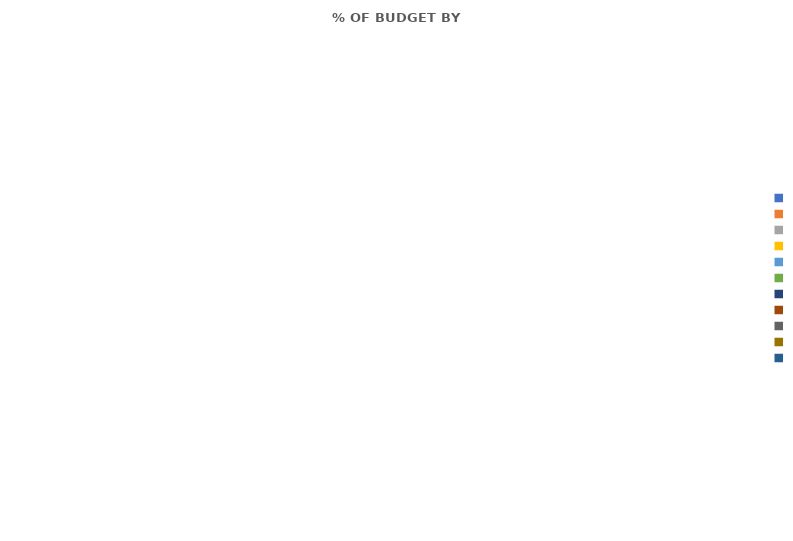
| Category | Series 0 | Series 1 |
|---|---|---|
|  |  | 0 |
|  |  | 0 |
|  |  | 0 |
|  |  | 0 |
|  |  | 0 |
|  |  | 0 |
|  |  | 0 |
|  |  | 0 |
|  |  | 0 |
|  |  | 0 |
|  |  | 0 |